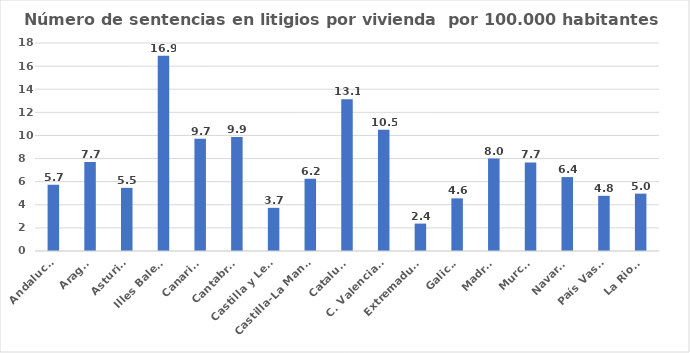
| Category | Número de sentencias en litigios por vivienda  por 100.000 habitantes |
|---|---|
| Andalucía | 5.74 |
| Aragón | 7.708 |
| Asturias | 5.464 |
| Illes Balears | 16.905 |
| Canarias | 9.716 |
| Cantabria | 9.855 |
| Castilla y León | 3.735 |
| Castilla-La Mancha | 6.248 |
| Cataluña | 13.128 |
| C. Valenciana | 10.502 |
| Extremadura | 2.371 |
| Galicia | 4.556 |
| Madrid | 8.001 |
| Murcia | 7.664 |
| Navarra | 6.397 |
| País Vasco | 4.775 |
| La Rioja | 4.965 |